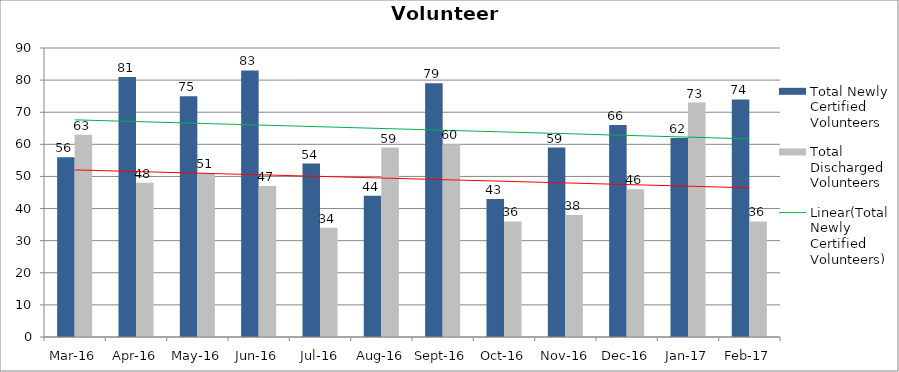
| Category | Total Newly Certified Volunteers | Total Discharged Volunteers |
|---|---|---|
| Mar-16 | 56 | 63 |
| Apr-16 | 81 | 48 |
| May-16 | 75 | 51 |
| Jun-16 | 83 | 47 |
| Jul-16 | 54 | 34 |
| Aug-16 | 44 | 59 |
| Sep-16 | 79 | 60 |
| Oct-16 | 43 | 36 |
| Nov-16 | 59 | 38 |
| Dec-16 | 66 | 46 |
| Jan-17 | 62 | 73 |
| Feb-17 | 74 | 36 |